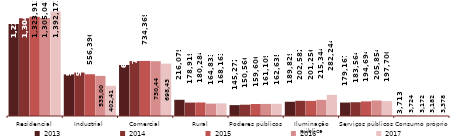
| Category | 2013 | 2014 | 2015 | 2016 | 2017 |
|---|---|---|---|---|---|
| Residencial | 1225494 | 1304933 | 1323913 | 1305041 | 1392173 |
| Industrial | 554697 | 579270 | 556396 | 535002 | 402410 |
| Comercial | 680412 | 731982 | 734369 | 730449 | 698435 |
| Rural | 216079 | 178919 | 180284 | 164833 | 168163 |
| Poderes públicos | 145272 | 150566 | 159606 | 161109 | 162635 |
| Iluminação pública | 189829 | 202582 | 201256 | 215344 | 282244 |
| Serviços públicos | 179167 | 183564 | 194694 | 205854 | 197700 |
| Consumo próprio | 3713 | 3724 | 3172 | 3182 | 3378 |